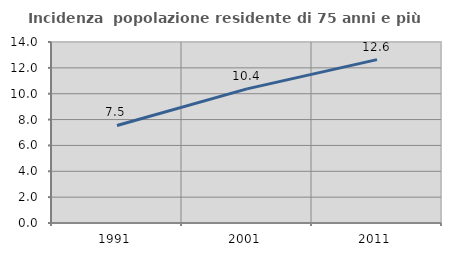
| Category | Incidenza  popolazione residente di 75 anni e più |
|---|---|
| 1991.0 | 7.542 |
| 2001.0 | 10.376 |
| 2011.0 | 12.637 |